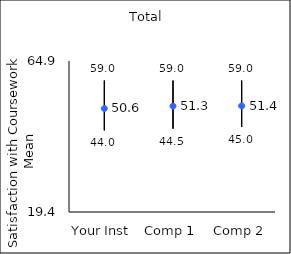
| Category | 25th percentile | 75th percentile | Mean |
|---|---|---|---|
| Your Inst | 44 | 59 | 50.59 |
| Comp 1 | 44.5 | 59 | 51.29 |
| Comp 2 | 45 | 59 | 51.37 |